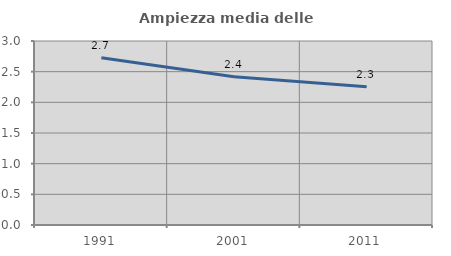
| Category | Ampiezza media delle famiglie |
|---|---|
| 1991.0 | 2.728 |
| 2001.0 | 2.417 |
| 2011.0 | 2.255 |